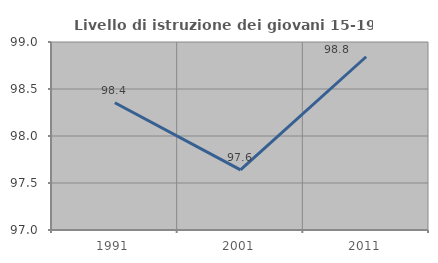
| Category | Livello di istruzione dei giovani 15-19 anni |
|---|---|
| 1991.0 | 98.354 |
| 2001.0 | 97.639 |
| 2011.0 | 98.843 |